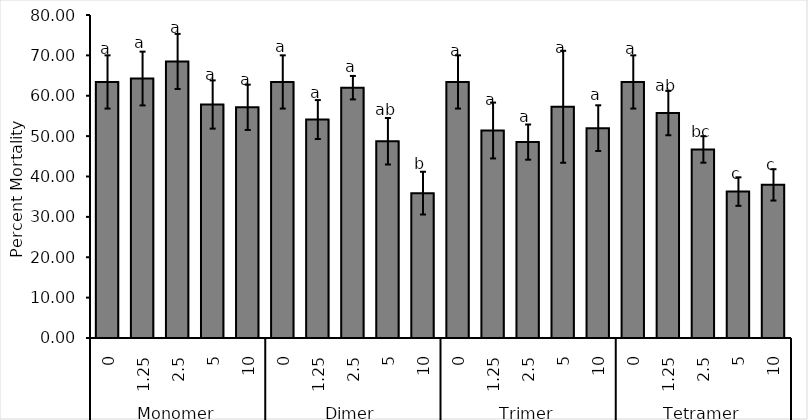
| Category | Mean |
|---|---|
| 0 | 63.415 |
| 1 | 64.268 |
| 2 | 68.498 |
| 3 | 57.829 |
| 4 | 57.135 |
| 5 | 63.415 |
| 6 | 54.107 |
| 7 | 62 |
| 8 | 48.731 |
| 9 | 35.881 |
| 10 | 63.415 |
| 11 | 51.389 |
| 12 | 48.52 |
| 13 | 57.269 |
| 14 | 51.981 |
| 15 | 63.415 |
| 16 | 55.714 |
| 17 | 46.7 |
| 18 | 36.268 |
| 19 | 37.926 |